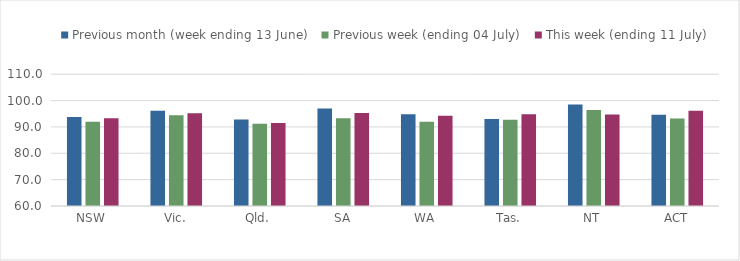
| Category | Previous month (week ending 13 June) | Previous week (ending 04 July) | This week (ending 11 July) |
|---|---|---|---|
| NSW | 93.744 | 91.997 | 93.239 |
| Vic. | 96.09 | 94.463 | 95.151 |
| Qld. | 92.776 | 91.176 | 91.486 |
| SA | 97 | 93.302 | 95.24 |
| WA | 94.765 | 91.917 | 94.206 |
| Tas. | 93.037 | 92.735 | 94.795 |
| NT | 98.507 | 96.418 | 94.693 |
| ACT | 94.573 | 93.228 | 96.17 |